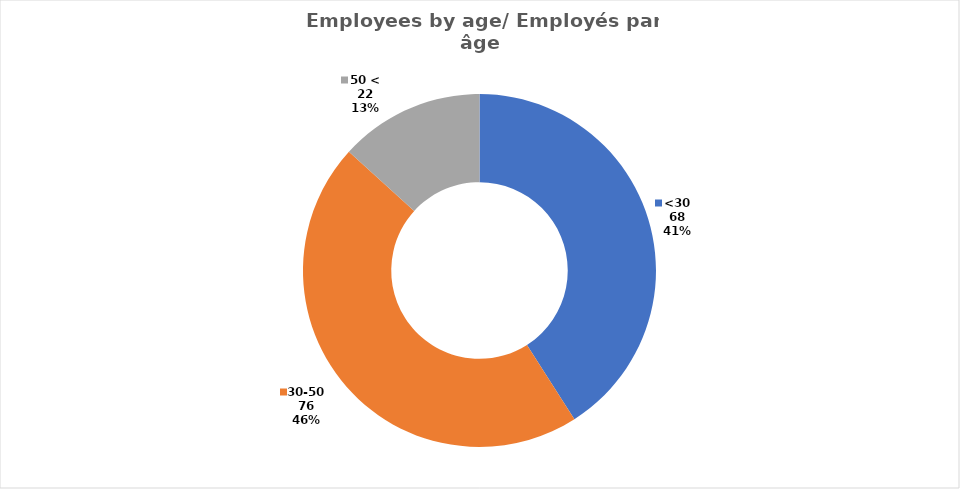
| Category | Series 0 |
|---|---|
| <30 | 68 |
| 30-50 | 76 |
| 50 < | 22 |